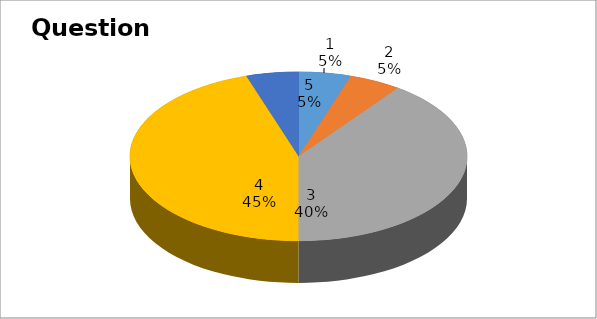
| Category | Series 0 |
|---|---|
| 0 | 1 |
| 1 | 1 |
| 2 | 8 |
| 3 | 9 |
| 4 | 1 |